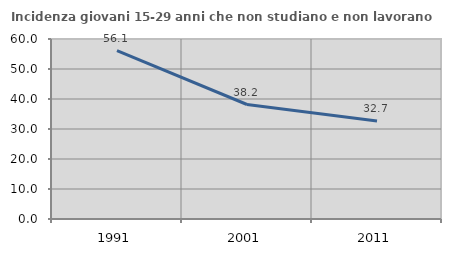
| Category | Incidenza giovani 15-29 anni che non studiano e non lavorano  |
|---|---|
| 1991.0 | 56.137 |
| 2001.0 | 38.164 |
| 2011.0 | 32.672 |